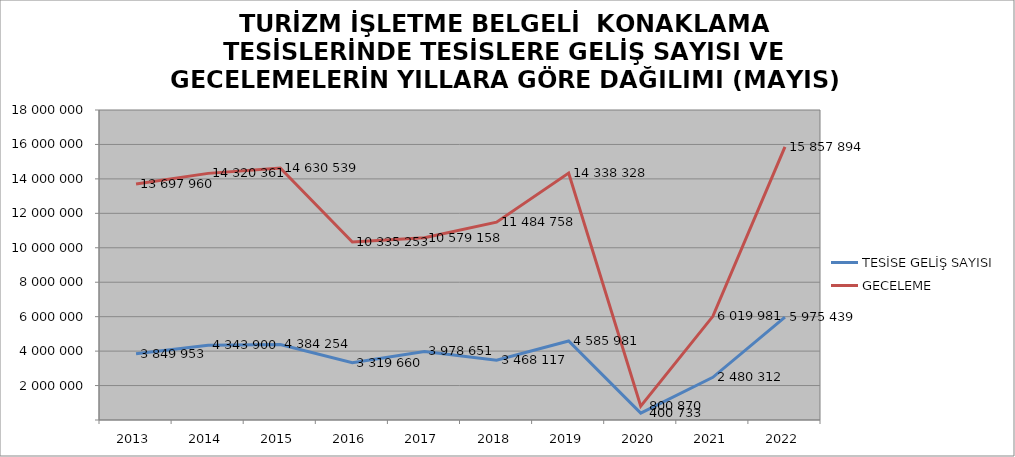
| Category | TESİSE GELİŞ SAYISI | GECELEME |
|---|---|---|
| 2013 | 3849953 | 13697960 |
| 2014 | 4343900 | 14320361 |
| 2015 | 4384254 | 14630539 |
| 2016 | 3319660 | 10335253 |
| 2017 | 3978651 | 10579158 |
| 2018 | 3468117 | 11484758 |
| 2019 | 4585981 | 14338328 |
| 2020 | 400733 | 800870 |
| 2021 | 2480312 | 6019981 |
| 2022 | 5975439 | 15857894 |